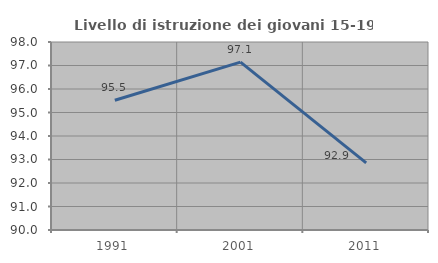
| Category | Livello di istruzione dei giovani 15-19 anni |
|---|---|
| 1991.0 | 95.522 |
| 2001.0 | 97.143 |
| 2011.0 | 92.857 |